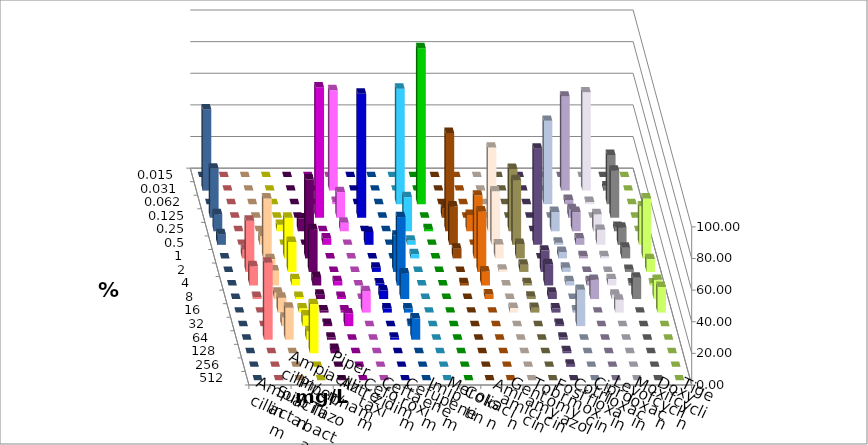
| Category | Ampicillin | Ampicillin/ Sulbactam | Piperacillin | Piperacillin/ Tazobactam | Aztreonam | Cefotaxim | Ceftazidim | Cefuroxim | Imipenem | Meropenem | Colistin | Amikacin | Gentamicin | Tobramycin | Fosfomycin | Cotrimoxazol | Ciprofloxacin | Levofloxacin | Moxifloxacin | Doxycyclin | Tigecyclin |
|---|---|---|---|---|---|---|---|---|---|---|---|---|---|---|---|---|---|---|---|---|---|
| 0.015 | 0 | 0 | 0 | 0 | 0 | 0 | 0 | 0 | 0 | 0 | 0 | 0 | 0 | 0 | 0 | 0 | 0 | 0 | 0 | 0 | 0 |
| 0.031 | 0 | 0 | 0 | 0 | 0 | 63.514 | 0 | 0 | 0 | 0 | 0 | 0 | 0 | 0 | 0 | 0 | 59.459 | 62.162 | 2.703 | 0 | 51.351 |
| 0.062 | 0 | 0 | 0 | 0 | 0 | 1.351 | 0 | 0 | 72.973 | 98.649 | 0 | 0 | 0 | 0 | 0 | 52.703 | 2.703 | 1.351 | 31.081 | 0 | 0 |
| 0.125 | 0 | 0 | 0 | 0 | 82.432 | 16.216 | 78.378 | 0 | 0 | 0 | 6.061 | 0 | 0 | 0 | 0 | 0 | 5.405 | 0 | 29.73 | 0 | 31.081 |
| 0.25 | 0 | 0 | 4.054 | 8.108 | 0 | 5.405 | 0 | 0 | 21.622 | 1.351 | 62.121 | 10.294 | 52.941 | 39.394 | 0 | 12.162 | 12.162 | 10.811 | 2.703 | 0 | 10.811 |
| 0.5 | 0 | 5.405 | 0 | 0 | 4.054 | 0 | 8.108 | 0 | 2.703 | 0 | 24.242 | 0 | 33.824 | 40.909 | 60.811 | 1.351 | 4.054 | 9.459 | 10.811 | 24.324 | 6.757 |
| 1.0 | 5.405 | 37.838 | 25.676 | 50 | 0 | 0 | 0 | 0 | 2.703 | 0 | 6.061 | 39.706 | 8.824 | 9.091 | 0 | 4.054 | 1.351 | 1.351 | 6.757 | 37.838 | 0 |
| 2.0 | 32.432 | 8.108 | 18.919 | 27.027 | 0 | 0 | 2.703 | 22.973 | 0 | 0 | 0 | 38.235 | 1.471 | 4.545 | 13.514 | 2.703 | 0 | 0 | 1.351 | 8.108 | 0 |
| 4.0 | 12.162 | 9.459 | 4.054 | 5.405 | 2.703 | 0 | 1.351 | 43.243 | 0 | 0 | 1.515 | 8.824 | 0 | 1.515 | 13.514 | 2.703 | 2.703 | 4.054 | 1.351 | 1.351 | 0 |
| 8.0 | 1.351 | 4.054 | 1.351 | 2.703 | 1.351 | 0 | 5.405 | 16.216 | 0 | 0 | 0 | 2.941 | 0 | 1.515 | 4.054 | 0 | 12.162 | 2.703 | 13.514 | 12.162 | 0 |
| 16.0 | 0 | 9.459 | 2.703 | 1.351 | 1.351 | 13.514 | 2.703 | 2.703 | 0 | 0 | 0 | 0 | 2.941 | 3.03 | 2.703 | 1.351 | 0 | 8.108 | 0 | 16.216 | 0 |
| 32.0 | 0 | 5.405 | 6.757 | 1.351 | 8.108 | 0 | 0 | 1.351 | 0 | 0 | 0 | 0 | 0 | 0 | 1.351 | 22.973 | 0 | 0 | 0 | 0 | 0 |
| 64.0 | 48.649 | 20.27 | 5.405 | 1.351 | 0 | 0 | 1.351 | 13.514 | 0 | 0 | 0 | 0 | 0 | 0 | 1.351 | 0 | 0 | 0 | 0 | 0 | 0 |
| 128.0 | 0 | 0 | 31.081 | 2.703 | 0 | 0 | 0 | 0 | 0 | 0 | 0 | 0 | 0 | 0 | 1.351 | 0 | 0 | 0 | 0 | 0 | 0 |
| 256.0 | 0 | 0 | 0 | 0 | 0 | 0 | 0 | 0 | 0 | 0 | 0 | 0 | 0 | 0 | 1.351 | 0 | 0 | 0 | 0 | 0 | 0 |
| 512.0 | 0 | 0 | 0 | 0 | 0 | 0 | 0 | 0 | 0 | 0 | 0 | 0 | 0 | 0 | 0 | 0 | 0 | 0 | 0 | 0 | 0 |